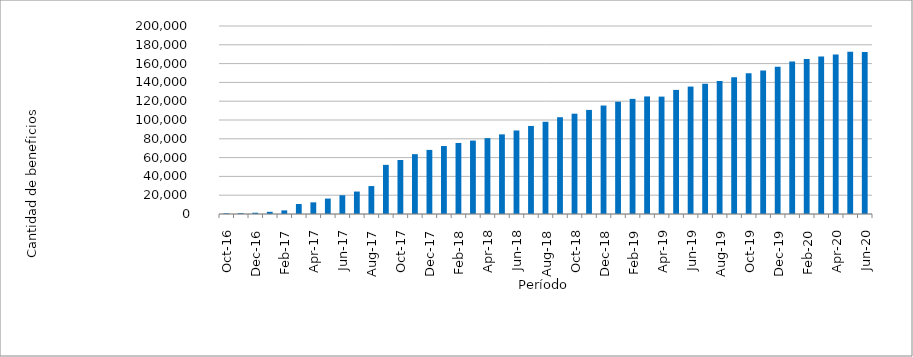
| Category | Series 0 |
|---|---|
| 2016-10-01 | 734 |
| 2016-11-01 | 840 |
| 2016-12-01 | 1355 |
| 2017-01-01 | 2338 |
| 2017-02-01 | 3845 |
| 2017-03-01 | 10612 |
| 2017-04-01 | 12409 |
| 2017-05-01 | 16412 |
| 2017-06-01 | 19947 |
| 2017-07-01 | 23878 |
| 2017-08-01 | 29715 |
| 2017-09-01 | 52268 |
| 2017-10-01 | 57452 |
| 2017-11-01 | 63653 |
| 2017-12-01 | 68183 |
| 2018-01-01 | 72302 |
| 2018-02-01 | 75570 |
| 2018-03-01 | 78119 |
| 2018-04-01 | 80700 |
| 2018-05-01 | 84709 |
| 2018-06-01 | 88857 |
| 2018-07-01 | 93664 |
| 2018-08-01 | 98093 |
| 2018-09-01 | 102951 |
| 2018-10-01 | 106684 |
| 2018-11-01 | 110711 |
| 2018-12-01 | 115377 |
| 2019-01-01 | 119439 |
| 2019-02-01 | 122487 |
| 2019-03-01 | 125066 |
| 2019-04-01 | 124881 |
| 2019-05-01 | 132024 |
| 2019-06-01 | 135562 |
| 2019-07-01 | 138695 |
| 2019-08-01 | 141520 |
| 2019-09-01 | 145544 |
| 2019-10-01 | 149853 |
| 2019-11-01 | 152682 |
| 2019-12-01 | 156763 |
| 2020-01-01 | 162294 |
| 2020-02-01 | 164917 |
| 2020-03-01 | 167596 |
| 2020-04-01 | 169701 |
| 2020-05-01 | 172647 |
| 2020-06-01 | 172356 |